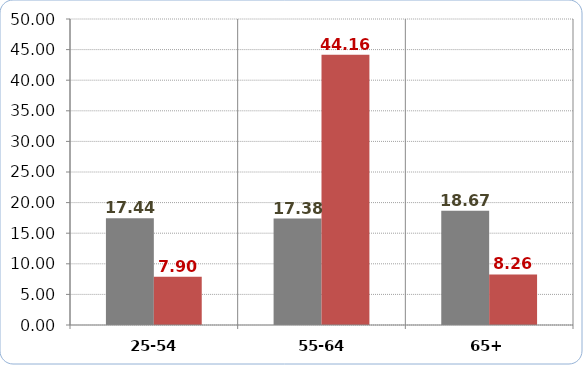
| Category | Real Income (07-15 percentage change) | People in Relative Poverty (07-15 percentage change) |
|---|---|---|
| 25-54 | 17.443 | 7.898 |
| 55-64 | 17.383 | 44.164 |
| 65+ | 18.672 | 8.264 |